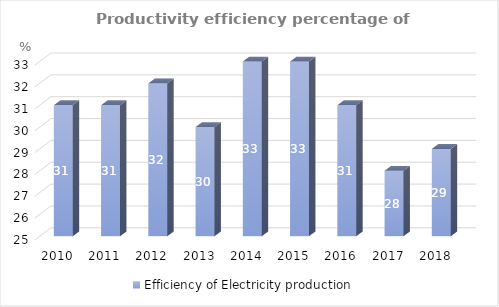
| Category | Efficiency of Electricity production  |
|---|---|
| 2010.0 | 31 |
| 2011.0 | 31 |
| 2012.0 | 32 |
| 2013.0 | 30 |
| 2014.0 | 33 |
| 2015.0 | 33 |
| 2016.0 | 31 |
| 2017.0 | 28 |
| 2018.0 | 29 |